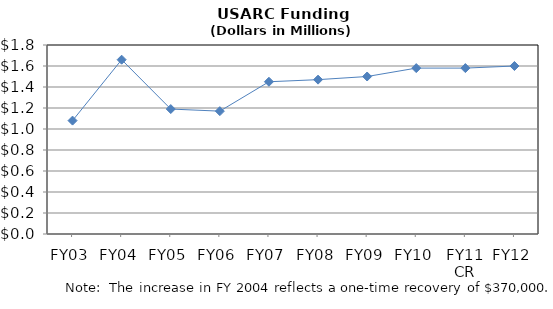
| Category | Series 0 |
|---|---|
| FY03 | 1.08 |
| FY04 | 1.66 |
| FY05 | 1.19 |
| FY06 | 1.17 |
| FY07 | 1.45 |
| FY08 | 1.47 |
| FY09 | 1.5 |
| FY10 | 1.58 |
| FY11
CR | 1.58 |
| FY12 | 1.6 |